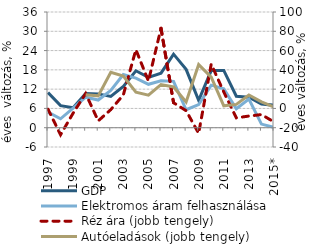
| Category | GDP | Elektromos áram felhasználása |
|---|---|---|
| 1997 | 10.954 | 4.832 |
| 1998 | 6.875 | 2.783 |
| 1999 | 6.25 | 6.094 |
| 2000 | 10.635 | 9.488 |
| 2001 | 10.523 | 8.616 |
| 2002 | 9.737 | 11.604 |
| 2003 | 12.873 | 16.533 |
| 2004 | 17.711 | 15.447 |
| 2005 | 15.674 | 13.515 |
| 2006 | 16.966 | 14.624 |
| 2007 | 22.881 | 14.425 |
| 2008 | 18.146 | 5.593 |
| 2009 | 8.552 | 7.211 |
| 2010 | 17.779 | 13.243 |
| 2011 | 17.83 | 12.081 |
| 2012 | 9.8 | 5.883 |
| 2013 | 9.505 | 8.913 |
| 2014 | 7.375 | 1.128 |
| 2015* | 7 | 0.11 |